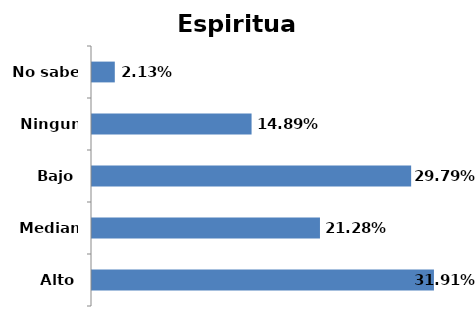
| Category | Series 0 |
|---|---|
| Alto | 0.319 |
| Mediano | 0.213 |
| Bajo | 0.298 |
| Ninguno | 0.149 |
| No sabe | 0.021 |